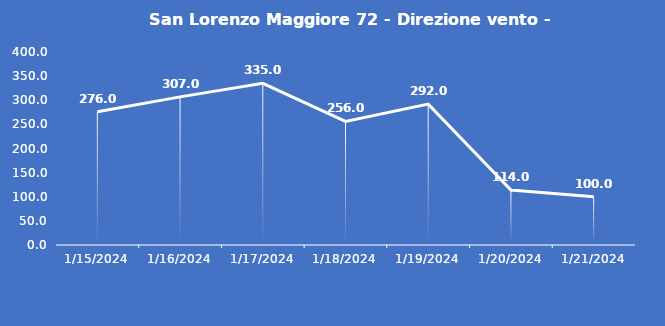
| Category | San Lorenzo Maggiore 72 - Direzione vento - Grezzo (°N) |
|---|---|
| 1/15/24 | 276 |
| 1/16/24 | 307 |
| 1/17/24 | 335 |
| 1/18/24 | 256 |
| 1/19/24 | 292 |
| 1/20/24 | 114 |
| 1/21/24 | 100 |